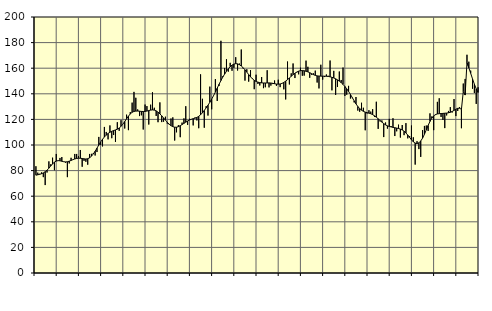
| Category | Piggar | Series 1 |
|---|---|---|
| nan | 83.4 | 76.41 |
| 1.0 | 78.4 | 76.74 |
| 1.0 | 77.5 | 77.07 |
| 1.0 | 78.6 | 77.55 |
| 1.0 | 74.9 | 78.22 |
| 1.0 | 68.7 | 79.12 |
| 1.0 | 78.5 | 80.3 |
| 1.0 | 87.2 | 81.89 |
| 1.0 | 84.9 | 83.62 |
| 1.0 | 90.1 | 85.26 |
| 1.0 | 80.3 | 86.59 |
| 1.0 | 93 | 87.44 |
| nan | 87.6 | 87.79 |
| 2.0 | 89.9 | 87.67 |
| 2.0 | 90.6 | 87.31 |
| 2.0 | 87.1 | 86.94 |
| 2.0 | 86.2 | 86.77 |
| 2.0 | 74.9 | 86.91 |
| 2.0 | 85.6 | 87.36 |
| 2.0 | 90 | 87.94 |
| 2.0 | 88.5 | 88.55 |
| 2.0 | 93 | 89.09 |
| 2.0 | 93 | 89.5 |
| 2.0 | 91.4 | 89.7 |
| nan | 96.1 | 89.64 |
| 3.0 | 83 | 89.45 |
| 3.0 | 87.6 | 89.19 |
| 3.0 | 86.9 | 89.06 |
| 3.0 | 84.6 | 89.28 |
| 3.0 | 93 | 89.98 |
| 3.0 | 93.1 | 91.23 |
| 3.0 | 93.6 | 92.97 |
| 3.0 | 91.8 | 95.13 |
| 3.0 | 94.5 | 97.55 |
| 3.0 | 106.3 | 100.03 |
| 3.0 | 100.1 | 102.37 |
| nan | 98.9 | 104.46 |
| 4.0 | 114.1 | 106.25 |
| 4.0 | 110.2 | 107.75 |
| 4.0 | 104.4 | 108.99 |
| 4.0 | 115.3 | 109.97 |
| 4.0 | 105.3 | 110.71 |
| 4.0 | 107.8 | 111.27 |
| 4.0 | 102.4 | 111.76 |
| 4.0 | 117.8 | 112.37 |
| 4.0 | 111.1 | 113.27 |
| 4.0 | 119.4 | 114.56 |
| 4.0 | 116.3 | 116.29 |
| nan | 112.9 | 118.35 |
| 5.0 | 123.7 | 120.49 |
| 5.0 | 111.6 | 122.52 |
| 5.0 | 125.7 | 124.27 |
| 5.0 | 133.1 | 125.53 |
| 5.0 | 141.5 | 126.22 |
| 5.0 | 136.9 | 126.48 |
| 5.0 | 127.8 | 126.52 |
| 5.0 | 122.6 | 126.4 |
| 5.0 | 123.2 | 126.24 |
| 5.0 | 112.1 | 126.17 |
| 5.0 | 131.6 | 126.25 |
| nan | 130.4 | 126.51 |
| 6.0 | 116 | 126.91 |
| 6.0 | 131.5 | 127.27 |
| 6.0 | 141.2 | 127.43 |
| 6.0 | 129.1 | 127.25 |
| 6.0 | 122.7 | 126.66 |
| 6.0 | 117.8 | 125.67 |
| 6.0 | 133.3 | 124.34 |
| 6.0 | 117.9 | 122.8 |
| 6.0 | 118.2 | 121.16 |
| 6.0 | 122.1 | 119.45 |
| 6.0 | 116.7 | 117.81 |
| nan | 116 | 116.31 |
| 7.0 | 120.7 | 115.11 |
| 7.0 | 121.6 | 114.32 |
| 7.0 | 103.5 | 113.91 |
| 7.0 | 109.9 | 113.88 |
| 7.0 | 115.5 | 114.33 |
| 7.0 | 106.1 | 115.09 |
| 7.0 | 117.5 | 115.97 |
| 7.0 | 120.8 | 116.9 |
| 7.0 | 130.3 | 117.85 |
| 7.0 | 115.7 | 118.76 |
| 7.0 | 120.5 | 119.5 |
| nan | 120 | 120.09 |
| 8.0 | 115.3 | 120.56 |
| 8.0 | 121.5 | 120.97 |
| 8.0 | 119.2 | 121.52 |
| 8.0 | 113.1 | 122.4 |
| 8.0 | 155.2 | 123.61 |
| 8.0 | 136.1 | 125.15 |
| 8.0 | 113.5 | 126.98 |
| 8.0 | 130.3 | 128.97 |
| 8.0 | 123 | 131.09 |
| 8.0 | 145.6 | 133.35 |
| 8.0 | 127.9 | 135.82 |
| nan | 138.7 | 138.52 |
| 9.0 | 151.5 | 141.39 |
| 9.0 | 134.4 | 144.4 |
| 9.0 | 146.2 | 147.45 |
| 9.0 | 181.4 | 150.36 |
| 9.0 | 153.7 | 153.03 |
| 9.0 | 160.2 | 155.41 |
| 9.0 | 167 | 157.57 |
| 9.0 | 157.3 | 159.55 |
| 9.0 | 164.2 | 161.19 |
| 9.0 | 158 | 162.44 |
| 9.0 | 160.3 | 163.22 |
| nan | 168.6 | 163.55 |
| 10.0 | 158.2 | 163.38 |
| 10.0 | 163.6 | 162.75 |
| 10.0 | 174.6 | 161.73 |
| 10.0 | 159.8 | 160.36 |
| 10.0 | 150.3 | 158.73 |
| 10.0 | 159.2 | 156.91 |
| 10.0 | 149.5 | 155.03 |
| 10.0 | 158.5 | 153.27 |
| 10.0 | 152 | 151.74 |
| 10.0 | 143.6 | 150.53 |
| 10.0 | 154.9 | 149.67 |
| nan | 147.7 | 149.1 |
| 11.0 | 146.5 | 148.75 |
| 11.0 | 153.1 | 148.55 |
| 11.0 | 144.4 | 148.45 |
| 11.0 | 145.1 | 148.44 |
| 11.0 | 158.4 | 148.48 |
| 11.0 | 145 | 148.5 |
| 11.0 | 146.4 | 148.41 |
| 11.0 | 147.6 | 148.18 |
| 11.0 | 150.4 | 147.88 |
| 11.0 | 146.2 | 147.63 |
| 11.0 | 151 | 147.54 |
| nan | 145.2 | 147.67 |
| 12.0 | 148 | 148.11 |
| 12.0 | 143.5 | 148.88 |
| 12.0 | 135.6 | 149.9 |
| 12.0 | 165.2 | 151.09 |
| 12.0 | 147.3 | 152.37 |
| 12.0 | 156 | 153.67 |
| 12.0 | 163.7 | 154.95 |
| 12.0 | 152.3 | 156.08 |
| 12.0 | 156.7 | 157 |
| 12.0 | 155.2 | 157.69 |
| 12.0 | 160.4 | 158.08 |
| nan | 154.1 | 158.15 |
| 13.0 | 154.2 | 157.98 |
| 13.0 | 165.9 | 157.62 |
| 13.0 | 161.1 | 157.13 |
| 13.0 | 152.5 | 156.49 |
| 13.0 | 154.9 | 155.73 |
| 13.0 | 156 | 155 |
| 13.0 | 158.1 | 154.39 |
| 13.0 | 148.8 | 154.01 |
| 13.0 | 144.2 | 153.85 |
| 13.0 | 162.7 | 153.81 |
| 13.0 | 151.1 | 153.78 |
| nan | 153.1 | 153.75 |
| 14.0 | 155.1 | 153.7 |
| 14.0 | 154.1 | 153.56 |
| 14.0 | 166 | 153.28 |
| 14.0 | 142.7 | 152.89 |
| 14.0 | 157.9 | 152.38 |
| 14.0 | 139.1 | 151.71 |
| 14.0 | 145.3 | 150.87 |
| 14.0 | 157.4 | 149.88 |
| 14.0 | 150.8 | 148.73 |
| 14.0 | 160.5 | 147.34 |
| 14.0 | 138.3 | 145.72 |
| nan | 139.3 | 143.9 |
| 15.0 | 146.2 | 141.84 |
| 15.0 | 136.3 | 139.54 |
| 15.0 | 136.6 | 137.05 |
| 15.0 | 133.3 | 134.52 |
| 15.0 | 137.5 | 132.15 |
| 15.0 | 126.9 | 130.08 |
| 15.0 | 126 | 128.45 |
| 15.0 | 133 | 127.2 |
| 15.0 | 129.1 | 126.3 |
| 15.0 | 111.5 | 125.68 |
| 15.0 | 124.6 | 125.24 |
| nan | 127.2 | 124.88 |
| 16.0 | 126.1 | 124.42 |
| 16.0 | 128 | 123.72 |
| 16.0 | 121.9 | 122.81 |
| 16.0 | 133.8 | 121.72 |
| 16.0 | 112.6 | 120.46 |
| 16.0 | 118.4 | 119.15 |
| 16.0 | 119.2 | 117.88 |
| 16.0 | 106.2 | 116.72 |
| 16.0 | 117.6 | 115.71 |
| 16.0 | 112.8 | 114.96 |
| 16.0 | 120.4 | 114.48 |
| nan | 114.8 | 114.12 |
| 17.0 | 120.9 | 113.78 |
| 17.0 | 107 | 113.51 |
| 17.0 | 110.7 | 113.22 |
| 17.0 | 115.9 | 112.87 |
| 17.0 | 105.8 | 112.4 |
| 17.0 | 115.6 | 111.75 |
| 17.0 | 107.7 | 110.76 |
| 17.0 | 117.1 | 109.4 |
| 17.0 | 105.2 | 107.76 |
| 17.0 | 107 | 105.92 |
| 17.0 | 115.2 | 104.06 |
| nan | 106 | 102.48 |
| 18.0 | 84.7 | 101.46 |
| 18.0 | 103 | 101.17 |
| 18.0 | 96.8 | 101.71 |
| 18.0 | 90.7 | 103.12 |
| 18.0 | 111.6 | 105.37 |
| 18.0 | 114.9 | 108.36 |
| 18.0 | 115.2 | 111.79 |
| 18.0 | 111 | 115.28 |
| 18.0 | 124.7 | 118.42 |
| 18.0 | 122.3 | 120.98 |
| 18.0 | 111.6 | 122.74 |
| nan | 123.4 | 123.76 |
| 19.0 | 133.7 | 124.26 |
| 19.0 | 136.5 | 124.47 |
| 19.0 | 121.9 | 124.56 |
| 19.0 | 119.6 | 124.68 |
| 19.0 | 113.2 | 124.82 |
| 19.0 | 123.1 | 124.94 |
| 19.0 | 126.6 | 125.16 |
| 19.0 | 129.6 | 125.56 |
| 19.0 | 125.4 | 126.2 |
| 19.0 | 135.9 | 127.04 |
| 19.0 | 122.6 | 127.97 |
| nan | 126.6 | 128.67 |
| 20.0 | 129.6 | 128.73 |
| 20.0 | 113.1 | 127.88 |
| 20.0 | 148 | 141.72 |
| 20.0 | 151.6 | 139.02 |
| 20.0 | 170.5 | 164.38 |
| 20.0 | 165.1 | 160.38 |
| 20.0 | 158.1 | 156.04 |
| 20.0 | 144 | 151.65 |
| 20.0 | 140.6 | 147.51 |
| 20.0 | 132.1 | 143.89 |
| 20.0 | 145.1 | 140.99 |